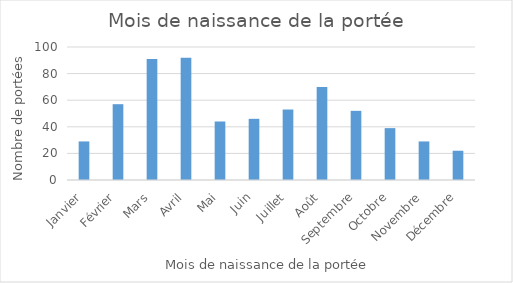
| Category | Series 0 |
|---|---|
| Janvier | 29 |
| Février | 57 |
| Mars | 91 |
| Avril | 92 |
| Mai | 44 |
| Juin | 46 |
| Juillet | 53 |
| Août | 70 |
| Septembre | 52 |
| Octobre | 39 |
| Novembre | 29 |
| Décembre | 22 |